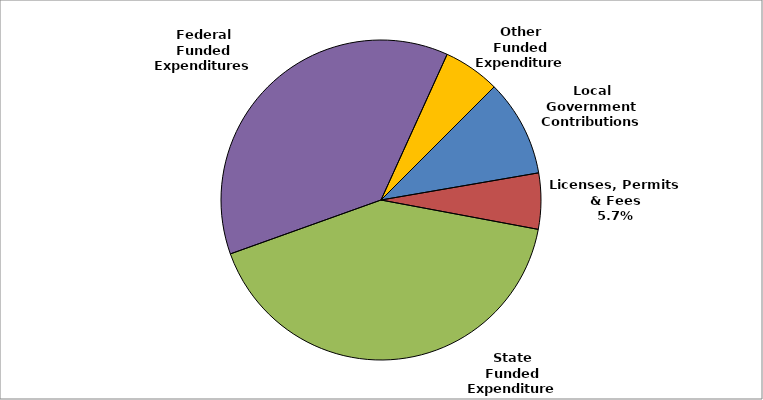
| Category | Series 0 |
|---|---|
| Local Government Contributions | 0.098 |
| Licenses, Permits & Fees | 0.057 |
| State Funded Expenditures | 0.416 |
| Federal Funded Expenditures | 0.373 |
| Other Funded Expenditures | 0.057 |